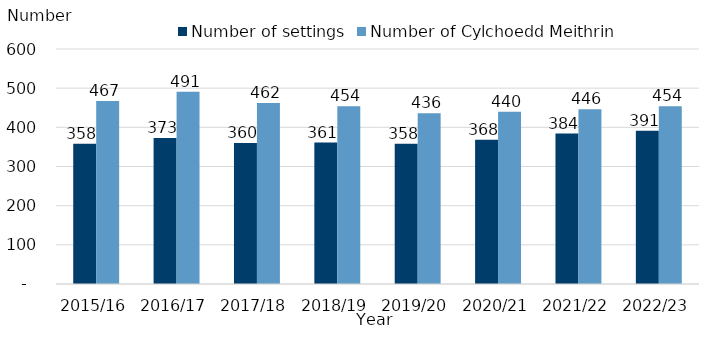
| Category | Number of settings | Number of Cylchoedd Meithrin |
|---|---|---|
| 2015/16 | 358 | 467 |
| 2016/17 | 373 | 491 |
| 2017/18 | 360 | 462 |
| 2018/19 | 361 | 454 |
| 2019/20 | 358 | 436 |
| 2020/21 | 368 | 440 |
| 2021/22 | 384 | 446 |
| 2022/23 | 391 | 454 |